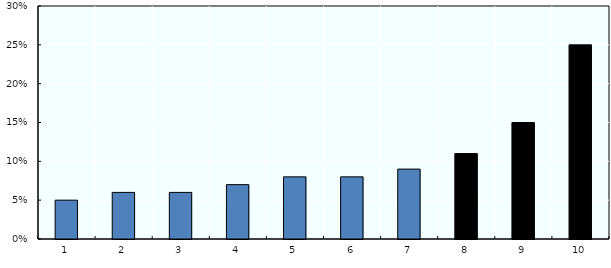
| Category | Current distribution of exemptions per income decile as a % |
|---|---|
| 1.0 | 0.05 |
| 2.0 | 0.06 |
| 3.0 | 0.06 |
| 4.0 | 0.07 |
| 5.0 | 0.08 |
| 6.0 | 0.08 |
| 7.0 | 0.09 |
| 8.0 | 0.11 |
| 9.0 | 0.15 |
| 10.0 | 0.25 |